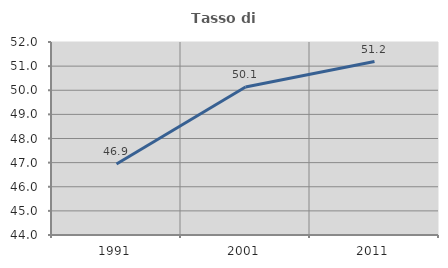
| Category | Tasso di occupazione   |
|---|---|
| 1991.0 | 46.944 |
| 2001.0 | 50.133 |
| 2011.0 | 51.188 |